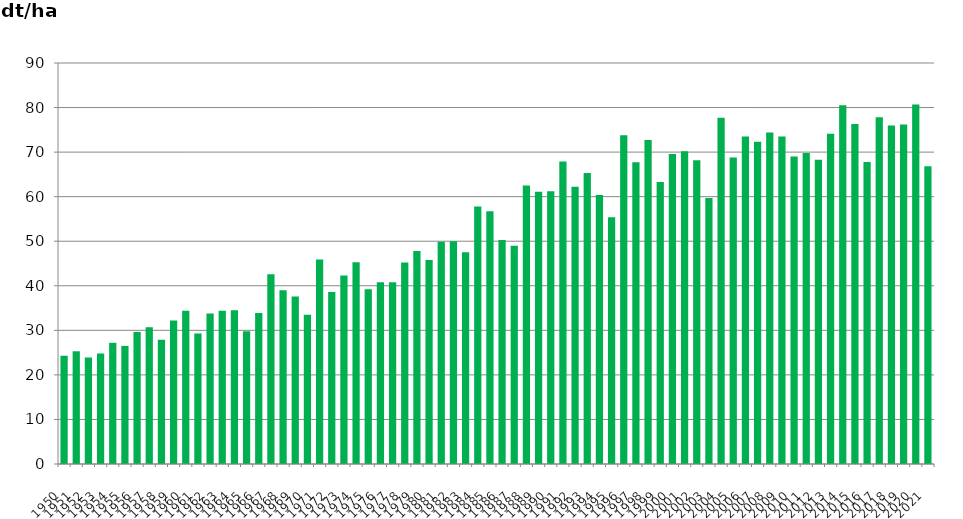
| Category | Series 8 |
|---|---|
| 1950.0 | 24.3 |
| 1951.0 | 25.3 |
| 1952.0 | 23.9 |
| 1953.0 | 24.8 |
| 1954.0 | 27.2 |
| 1955.0 | 26.5 |
| 1956.0 | 29.6 |
| 1957.0 | 30.7 |
| 1958.0 | 27.9 |
| 1959.0 | 32.2 |
| 1960.0 | 34.4 |
| 1961.0 | 29.3 |
| 1962.0 | 33.8 |
| 1963.0 | 34.4 |
| 1964.0 | 34.5 |
| 1965.0 | 29.8 |
| 1966.0 | 33.9 |
| 1967.0 | 42.6 |
| 1968.0 | 39 |
| 1969.0 | 37.6 |
| 1970.0 | 33.5 |
| 1971.0 | 45.9 |
| 1972.0 | 38.6 |
| 1973.0 | 42.3 |
| 1974.0 | 45.3 |
| 1975.0 | 39.2 |
| 1976.0 | 40.8 |
| 1977.0 | 40.8 |
| 1978.0 | 45.2 |
| 1979.0 | 47.8 |
| 1980.0 | 45.8 |
| 1981.0 | 49.9 |
| 1982.0 | 50 |
| 1983.0 | 47.5 |
| 1984.0 | 57.8 |
| 1985.0 | 56.7 |
| 1986.0 | 50.3 |
| 1987.0 | 49 |
| 1988.0 | 62.5 |
| 1989.0 | 61.1 |
| 1990.0 | 61.2 |
| 1991.0 | 67.9 |
| 1992.0 | 62.2 |
| 1993.0 | 65.3 |
| 1994.0 | 60.4 |
| 1995.0 | 55.4 |
| 1996.0 | 73.8 |
| 1997.0 | 67.7 |
| 1998.0 | 72.7 |
| 1999.0 | 63.3 |
| 2000.0 | 69.6 |
| 2001.0 | 70.2 |
| 2002.0 | 68.2 |
| 2003.0 | 59.7 |
| 2004.0 | 77.7 |
| 2005.0 | 68.8 |
| 2006.0 | 73.5 |
| 2007.0 | 72.3 |
| 2008.0 | 74.4 |
| 2009.0 | 73.5 |
| 2010.0 | 69 |
| 2011.0 | 69.8 |
| 2012.0 | 68.3 |
| 2013.0 | 74.139 |
| 2014.0 | 80.5 |
| 2015.0 | 76.3 |
| 2016.0 | 67.8 |
| 2017.0 | 77.8 |
| 2018.0 | 76 |
| 2019.0 | 76.2 |
| 2020.0 | 80.7 |
| 2021.0 | 66.8 |